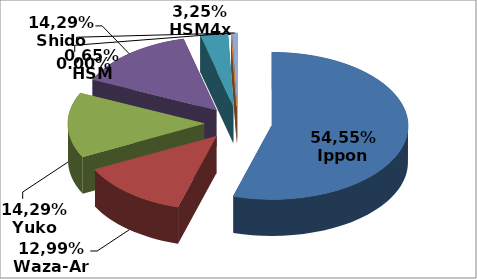
| Category | Series 0 |
|---|---|
| 0 | 0.545 |
| 1 | 0.13 |
| 2 | 0.143 |
| 3 | 0.143 |
| 4 | 0.032 |
| 5 | 0 |
| 6 | 0.006 |